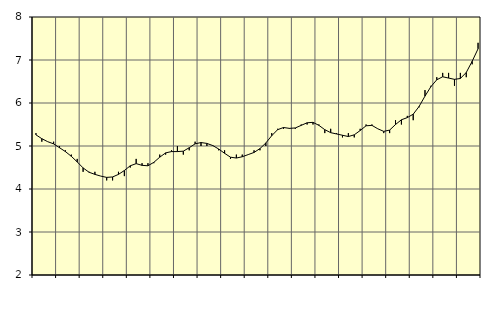
| Category | Piggar | Information och kommunikation, SNI 58-63 |
|---|---|---|
| nan | 5.3 | 5.26 |
| 1.0 | 5.1 | 5.17 |
| 1.0 | 5.1 | 5.1 |
| 1.0 | 5.1 | 5.05 |
| nan | 5 | 4.96 |
| 2.0 | 4.9 | 4.87 |
| 2.0 | 4.8 | 4.76 |
| 2.0 | 4.7 | 4.63 |
| nan | 4.4 | 4.49 |
| 3.0 | 4.4 | 4.39 |
| 3.0 | 4.4 | 4.34 |
| 3.0 | 4.3 | 4.3 |
| nan | 4.2 | 4.27 |
| 4.0 | 4.2 | 4.28 |
| 4.0 | 4.4 | 4.34 |
| 4.0 | 4.3 | 4.43 |
| nan | 4.5 | 4.54 |
| 5.0 | 4.7 | 4.59 |
| 5.0 | 4.6 | 4.55 |
| 5.0 | 4.6 | 4.54 |
| nan | 4.6 | 4.62 |
| 6.0 | 4.8 | 4.74 |
| 6.0 | 4.8 | 4.84 |
| 6.0 | 4.9 | 4.87 |
| nan | 5 | 4.87 |
| 7.0 | 4.8 | 4.88 |
| 7.0 | 4.9 | 4.96 |
| 7.0 | 5.1 | 5.05 |
| nan | 5 | 5.08 |
| 8.0 | 5 | 5.06 |
| 8.0 | 5 | 5.01 |
| 8.0 | 4.9 | 4.93 |
| nan | 4.9 | 4.83 |
| 9.0 | 4.7 | 4.74 |
| 9.0 | 4.8 | 4.72 |
| 9.0 | 4.8 | 4.75 |
| nan | 4.8 | 4.8 |
| 10.0 | 4.9 | 4.85 |
| 10.0 | 4.9 | 4.94 |
| 10.0 | 5 | 5.07 |
| nan | 5.3 | 5.24 |
| 11.0 | 5.4 | 5.38 |
| 11.0 | 5.4 | 5.43 |
| 11.0 | 5.4 | 5.41 |
| nan | 5.4 | 5.42 |
| 12.0 | 5.5 | 5.48 |
| 12.0 | 5.5 | 5.54 |
| 12.0 | 5.5 | 5.55 |
| nan | 5.5 | 5.48 |
| 13.0 | 5.3 | 5.38 |
| 13.0 | 5.4 | 5.31 |
| 13.0 | 5.3 | 5.28 |
| nan | 5.2 | 5.25 |
| 14.0 | 5.3 | 5.22 |
| 14.0 | 5.2 | 5.26 |
| 14.0 | 5.4 | 5.36 |
| nan | 5.5 | 5.47 |
| 15.0 | 5.5 | 5.48 |
| 15.0 | 5.4 | 5.4 |
| 15.0 | 5.3 | 5.34 |
| nan | 5.3 | 5.37 |
| 16.0 | 5.6 | 5.5 |
| 16.0 | 5.5 | 5.61 |
| 16.0 | 5.7 | 5.66 |
| nan | 5.6 | 5.74 |
| 17.0 | 5.9 | 5.92 |
| 17.0 | 6.3 | 6.16 |
| 17.0 | 6.4 | 6.38 |
| nan | 6.6 | 6.54 |
| 18.0 | 6.7 | 6.61 |
| 18.0 | 6.7 | 6.58 |
| 18.0 | 6.4 | 6.55 |
| nan | 6.7 | 6.57 |
| 19.0 | 6.6 | 6.71 |
| 19.0 | 6.9 | 6.97 |
| 19.0 | 7.4 | 7.26 |